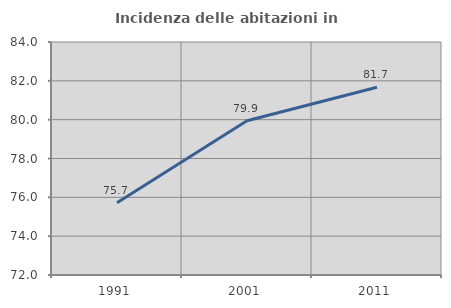
| Category | Incidenza delle abitazioni in proprietà  |
|---|---|
| 1991.0 | 75.719 |
| 2001.0 | 79.942 |
| 2011.0 | 81.667 |